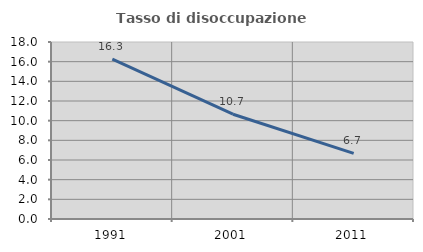
| Category | Tasso di disoccupazione giovanile  |
|---|---|
| 1991.0 | 16.268 |
| 2001.0 | 10.656 |
| 2011.0 | 6.667 |